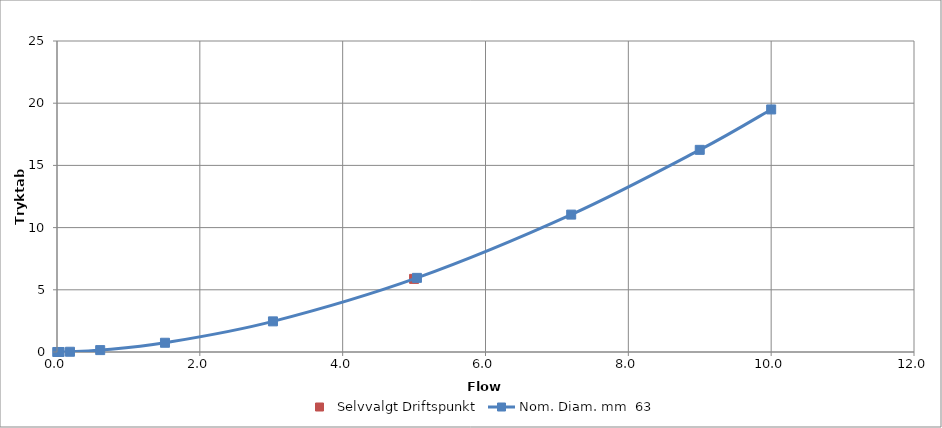
| Category | Selvvalgt |
|---|---|
| 5.0 | 5.878 |